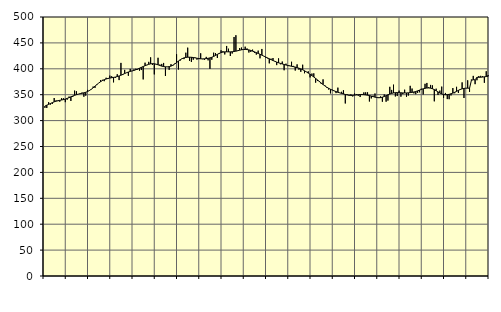
| Category | Piggar | Series 1 |
|---|---|---|
| nan | 324.6 | 328.09 |
| 1.0 | 324.4 | 329.76 |
| 1.0 | 335.5 | 331.3 |
| 1.0 | 331 | 333.05 |
| 1.0 | 332.2 | 334.66 |
| 1.0 | 343.6 | 336.21 |
| 1.0 | 339 | 337.47 |
| 1.0 | 337.6 | 338.39 |
| 1.0 | 336.5 | 339.12 |
| 1.0 | 343.3 | 339.79 |
| 1.0 | 343.1 | 340.55 |
| 1.0 | 335.6 | 341.56 |
| nan | 340.4 | 342.83 |
| 2.0 | 346.4 | 344.31 |
| 2.0 | 337.9 | 345.89 |
| 2.0 | 345.7 | 347.42 |
| 2.0 | 357.9 | 348.84 |
| 2.0 | 356.6 | 350.07 |
| 2.0 | 351.2 | 351.08 |
| 2.0 | 352.7 | 351.93 |
| 2.0 | 354.1 | 352.71 |
| 2.0 | 346.1 | 353.59 |
| 2.0 | 348.2 | 354.69 |
| 2.0 | 359.3 | 356.17 |
| nan | 358.8 | 358.12 |
| 3.0 | 361 | 360.5 |
| 3.0 | 365.7 | 363.32 |
| 3.0 | 363.2 | 366.42 |
| 3.0 | 368.6 | 369.54 |
| 3.0 | 372.4 | 372.47 |
| 3.0 | 378.2 | 375.08 |
| 3.0 | 378.8 | 377.28 |
| 3.0 | 376.1 | 379.01 |
| 3.0 | 382.7 | 380.32 |
| 3.0 | 382 | 381.33 |
| 3.0 | 386.8 | 382.1 |
| nan | 385.6 | 382.73 |
| 4.0 | 373.8 | 383.35 |
| 4.0 | 382.5 | 384.06 |
| 4.0 | 389.5 | 384.98 |
| 4.0 | 378.2 | 386.16 |
| 4.0 | 411.4 | 387.61 |
| 4.0 | 387.9 | 389.22 |
| 4.0 | 397.9 | 390.86 |
| 4.0 | 392.7 | 392.41 |
| 4.0 | 386.5 | 393.79 |
| 4.0 | 399.8 | 394.91 |
| 4.0 | 395.6 | 395.86 |
| nan | 398.9 | 396.89 |
| 5.0 | 400.1 | 398.13 |
| 5.0 | 398.4 | 399.57 |
| 5.0 | 396.4 | 401.13 |
| 5.0 | 397.6 | 402.76 |
| 5.0 | 379.5 | 404.38 |
| 5.0 | 411.8 | 405.97 |
| 5.0 | 407 | 407.45 |
| 5.0 | 413.4 | 408.69 |
| 5.0 | 422.1 | 409.56 |
| 5.0 | 407.4 | 409.93 |
| 5.0 | 389.2 | 409.71 |
| nan | 408.2 | 408.89 |
| 6.0 | 421.3 | 407.69 |
| 6.0 | 408.2 | 406.37 |
| 6.0 | 409.4 | 405.17 |
| 6.0 | 411.3 | 404.3 |
| 6.0 | 386.2 | 403.83 |
| 6.0 | 403.3 | 403.75 |
| 6.0 | 398 | 404.16 |
| 6.0 | 408.9 | 405.21 |
| 6.0 | 405.9 | 406.92 |
| 6.0 | 409.9 | 409.22 |
| 6.0 | 428.1 | 412 |
| nan | 398.6 | 414.94 |
| 7.0 | 415.9 | 417.57 |
| 7.0 | 419 | 419.63 |
| 7.0 | 418.7 | 421.09 |
| 7.0 | 431.1 | 421.95 |
| 7.0 | 440.8 | 422.33 |
| 7.0 | 415.4 | 422.4 |
| 7.0 | 413.2 | 422.21 |
| 7.0 | 417.6 | 421.77 |
| 7.0 | 421.9 | 421.13 |
| 7.0 | 417.7 | 420.43 |
| 7.0 | 418.7 | 419.78 |
| nan | 429.9 | 419.31 |
| 8.0 | 418.6 | 419.15 |
| 8.0 | 417.1 | 419.29 |
| 8.0 | 423 | 419.67 |
| 8.0 | 416.3 | 420.23 |
| 8.0 | 399.9 | 421.05 |
| 8.0 | 417.5 | 422.22 |
| 8.0 | 431.1 | 423.84 |
| 8.0 | 430.3 | 425.79 |
| 8.0 | 420.9 | 427.84 |
| 8.0 | 428.8 | 429.73 |
| 8.0 | 435.7 | 431.23 |
| nan | 434 | 432.23 |
| 9.0 | 427.7 | 432.7 |
| 9.0 | 444.1 | 432.8 |
| 9.0 | 438.8 | 432.73 |
| 9.0 | 424.7 | 432.71 |
| 9.0 | 429.5 | 432.9 |
| 9.0 | 461.4 | 433.35 |
| 9.0 | 464.8 | 434.06 |
| 9.0 | 435.6 | 434.89 |
| 9.0 | 440.1 | 435.83 |
| 9.0 | 441 | 436.67 |
| 9.0 | 436.7 | 437.23 |
| nan | 442.7 | 437.4 |
| 10.0 | 439.3 | 437.13 |
| 10.0 | 431.4 | 436.48 |
| 10.0 | 432.6 | 435.45 |
| 10.0 | 437 | 434.15 |
| 10.0 | 430.8 | 432.72 |
| 10.0 | 427.4 | 431.23 |
| 10.0 | 435.1 | 429.67 |
| 10.0 | 420.2 | 428.07 |
| 10.0 | 438.3 | 426.38 |
| 10.0 | 424.4 | 424.64 |
| 10.0 | 421.8 | 422.87 |
| nan | 420.2 | 421.11 |
| 11.0 | 410.5 | 419.36 |
| 11.0 | 419.5 | 417.65 |
| 11.0 | 420.8 | 416 |
| 11.0 | 414.8 | 414.45 |
| 11.0 | 407.1 | 412.99 |
| 11.0 | 420.1 | 411.65 |
| 11.0 | 408.7 | 410.47 |
| 11.0 | 414 | 409.35 |
| 11.0 | 397.2 | 408.31 |
| 11.0 | 409.9 | 407.31 |
| 11.0 | 405.2 | 406.41 |
| nan | 406.4 | 405.62 |
| 12.0 | 413.6 | 404.91 |
| 12.0 | 405.6 | 404.17 |
| 12.0 | 396.6 | 403.32 |
| 12.0 | 408.6 | 402.34 |
| 12.0 | 398.2 | 401.2 |
| 12.0 | 394.2 | 399.84 |
| 12.0 | 407.9 | 398.17 |
| 12.0 | 391.4 | 396.21 |
| 12.0 | 394.3 | 394.03 |
| 12.0 | 395.1 | 391.73 |
| 12.0 | 383.4 | 389.31 |
| nan | 390.8 | 386.79 |
| 13.0 | 391.2 | 384.16 |
| 13.0 | 373.3 | 381.39 |
| 13.0 | 376.4 | 378.5 |
| 13.0 | 374.4 | 375.55 |
| 13.0 | 371 | 372.56 |
| 13.0 | 379.6 | 369.63 |
| 13.0 | 368 | 366.92 |
| 13.0 | 363.5 | 364.47 |
| 13.0 | 360 | 362.35 |
| 13.0 | 352.5 | 360.49 |
| 13.0 | 359.5 | 358.85 |
| nan | 357.6 | 357.37 |
| 14.0 | 353.1 | 355.98 |
| 14.0 | 363.6 | 354.69 |
| 14.0 | 353.9 | 353.55 |
| 14.0 | 355.6 | 352.5 |
| 14.0 | 358.6 | 351.49 |
| 14.0 | 333.1 | 350.49 |
| 14.0 | 350.8 | 349.56 |
| 14.0 | 349.7 | 348.89 |
| 14.0 | 350.6 | 348.62 |
| 14.0 | 346.6 | 348.73 |
| 14.0 | 352.2 | 349.1 |
| nan | 350.9 | 349.56 |
| 15.0 | 348 | 349.98 |
| 15.0 | 345.5 | 350.22 |
| 15.0 | 351.4 | 350.23 |
| 15.0 | 354.4 | 350 |
| 15.0 | 354.6 | 349.57 |
| 15.0 | 354.6 | 349.04 |
| 15.0 | 336.9 | 348.37 |
| 15.0 | 342.8 | 347.47 |
| 15.0 | 348.3 | 346.36 |
| 15.0 | 352.3 | 345.27 |
| 15.0 | 344.5 | 344.47 |
| nan | 345 | 344.12 |
| 16.0 | 346.6 | 344.36 |
| 16.0 | 336.4 | 345.22 |
| 16.0 | 350.4 | 346.52 |
| 16.0 | 336.5 | 348.08 |
| 16.0 | 338.6 | 349.74 |
| 16.0 | 365.2 | 351.27 |
| 16.0 | 359.2 | 352.5 |
| 16.0 | 369.4 | 353.39 |
| 16.0 | 346.6 | 353.9 |
| 16.0 | 347.4 | 354.04 |
| 16.0 | 357.8 | 353.91 |
| nan | 346.2 | 353.66 |
| 17.0 | 351.1 | 353.44 |
| 17.0 | 359.7 | 353.33 |
| 17.0 | 346 | 353.38 |
| 17.0 | 348.3 | 353.6 |
| 17.0 | 367.1 | 354.02 |
| 17.0 | 361.9 | 354.56 |
| 17.0 | 352.5 | 355.27 |
| 17.0 | 350.9 | 356.2 |
| 17.0 | 353.5 | 357.38 |
| 17.0 | 354.6 | 358.78 |
| 17.0 | 361.5 | 360.16 |
| nan | 350.5 | 361.39 |
| 18.0 | 371 | 362.34 |
| 18.0 | 372.7 | 362.91 |
| 18.0 | 364.7 | 363.02 |
| 18.0 | 368.9 | 362.61 |
| 18.0 | 368 | 361.53 |
| 18.0 | 337.2 | 359.79 |
| 18.0 | 361.6 | 357.6 |
| 18.0 | 349.5 | 355.31 |
| 18.0 | 357.9 | 353.2 |
| 18.0 | 365.6 | 351.46 |
| 18.0 | 343.7 | 350.34 |
| nan | 353.4 | 349.92 |
| 19.0 | 341.5 | 350.08 |
| 19.0 | 341.3 | 350.7 |
| 19.0 | 348.6 | 351.72 |
| 19.0 | 362.8 | 353.05 |
| 19.0 | 352.8 | 354.64 |
| 19.0 | 365.2 | 356.47 |
| 19.0 | 353.3 | 358.38 |
| 19.0 | 359.1 | 360.06 |
| 19.0 | 373.8 | 361.34 |
| 19.0 | 343.6 | 362.18 |
| 19.0 | 362.6 | 362.56 |
| nan | 377.8 | 362.61 |
| 20.0 | 355.5 | 362.46 |
| 20.0 | 379.3 | 377.57 |
| 20.0 | 386.3 | 378.87 |
| 20.0 | 370.3 | 378.7 |
| 20.0 | 377.9 | 383.52 |
| 20.0 | 386.1 | 383.55 |
| 20.0 | 386.4 | 383.73 |
| 20.0 | 385.6 | 384.07 |
| 20.0 | 373 | 384.51 |
| 20.0 | 395.3 | 385 |
| 20.0 | 387.9 | 385.53 |